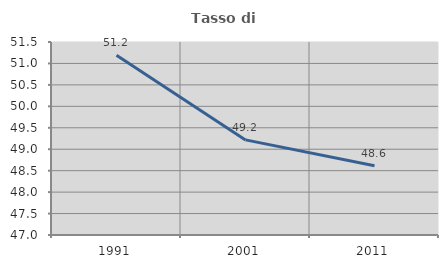
| Category | Tasso di occupazione   |
|---|---|
| 1991.0 | 51.193 |
| 2001.0 | 49.218 |
| 2011.0 | 48.614 |